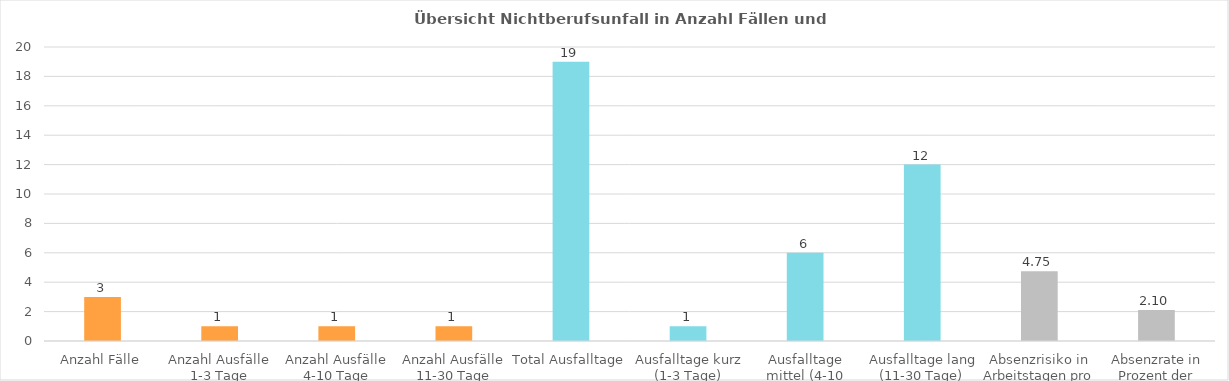
| Category | Nichtberufsunfall  |
|---|---|
| Anzahl Fälle | 3 |
| Anzahl Ausfälle 1-3 Tage | 1 |
| Anzahl Ausfälle 4-10 Tage | 1 |
| Anzahl Ausfälle 11-30 Tage | 1 |
| Total Ausfalltage | 19 |
| Ausfalltage kurz (1-3 Tage) | 1 |
| Ausfalltage mittel (4-10 Tage) | 6 |
| Ausfalltage lang (11-30 Tage) | 12 |
| Absenzrisiko in Arbeitstagen pro VB | 4.75 |
| Absenzrate in Prozent der Sollarbeitstage | 2.102 |